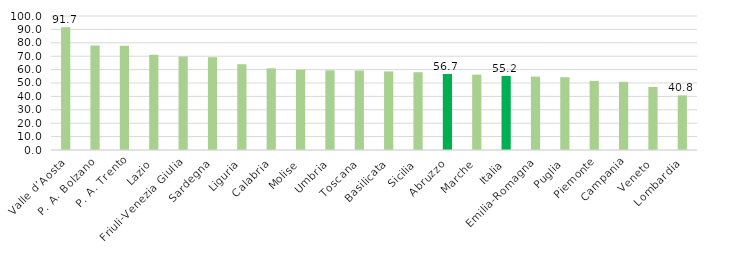
| Category | Series 0 |
|---|---|
| Valle d’Aosta | 91.667 |
| P. A. Bolzano | 77.906 |
| P. A. Trento | 77.78 |
| Lazio | 71.161 |
| Friuli-Venezia Giulia | 69.828 |
| Sardegna | 69.153 |
| Liguria | 64.044 |
| Calabria | 60.939 |
| Molise | 59.869 |
| Umbria | 59.434 |
| Toscana | 59.317 |
| Basilicata | 58.645 |
| Sicilia | 58.051 |
| Abruzzo | 56.739 |
| Marche | 56.247 |
| Italia | 55.217 |
| Emilia-Romagna | 54.777 |
| Puglia | 54.305 |
| Piemonte | 51.562 |
| Campania | 50.882 |
| Veneto | 47.066 |
| Lombardia | 40.768 |